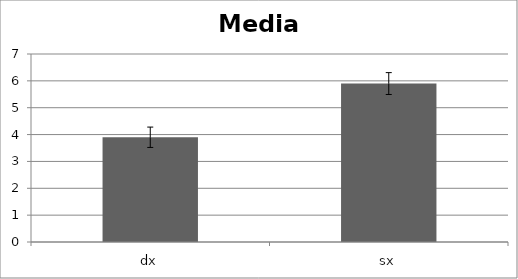
| Category | Media Scodinzolio |
|---|---|
| dx | 3.9 |
| sx | 5.9 |